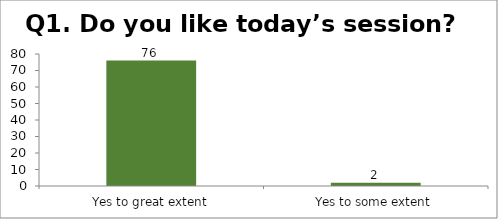
| Category | Q1. Do you like today’s session? |
|---|---|
| Yes to great extent | 76 |
| Yes to some extent | 2 |